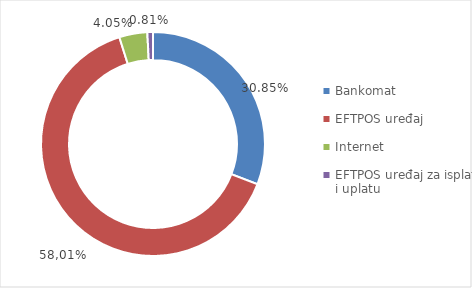
| Category | Series 0 |
|---|---|
| Bankomat | 9393651462 |
| EFTPOS uređaj | 19572839791 |
| Internet | 1232514631 |
| EFTPOS uređaj za isplatu i uplatu | 245777501 |